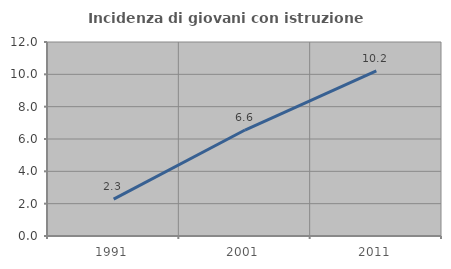
| Category | Incidenza di giovani con istruzione universitaria |
|---|---|
| 1991.0 | 2.278 |
| 2001.0 | 6.554 |
| 2011.0 | 10.214 |